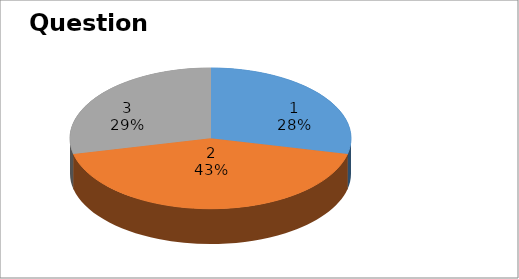
| Category | Series 0 |
|---|---|
| 0 | 4 |
| 1 | 6 |
| 2 | 4 |